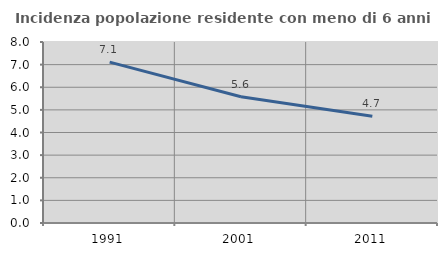
| Category | Incidenza popolazione residente con meno di 6 anni |
|---|---|
| 1991.0 | 7.111 |
| 2001.0 | 5.582 |
| 2011.0 | 4.714 |